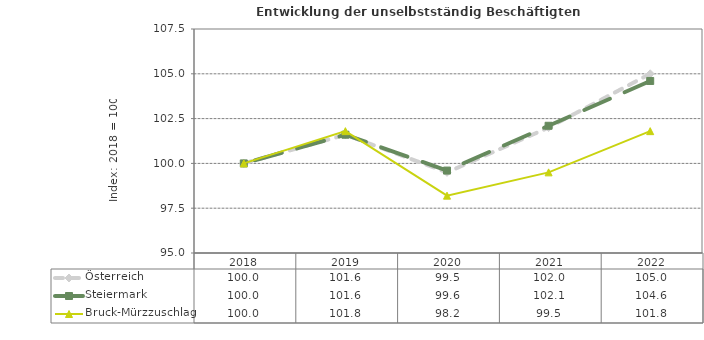
| Category | Österreich | Steiermark | Bruck-Mürzzuschlag |
|---|---|---|---|
| 2022.0 | 105 | 104.6 | 101.8 |
| 2021.0 | 102 | 102.1 | 99.5 |
| 2020.0 | 99.5 | 99.6 | 98.2 |
| 2019.0 | 101.6 | 101.6 | 101.8 |
| 2018.0 | 100 | 100 | 100 |